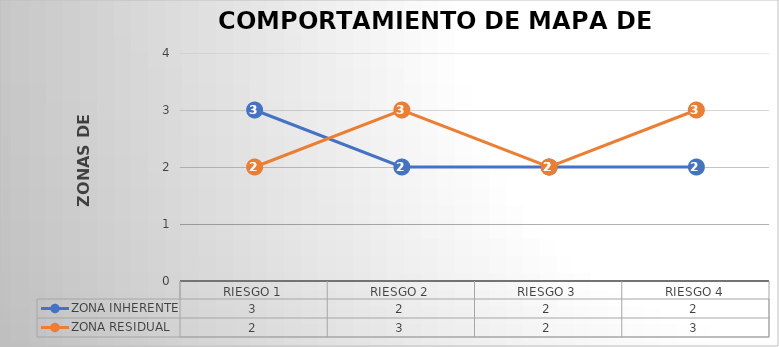
| Category | ZONA INHERENTE | ZONA RESIDUAL |
|---|---|---|
| RIESGO 1 | 3 | 2 |
| RIESGO 2 | 2 | 3 |
| RIESGO 3 | 2 | 2 |
| RIESGO 4 | 2 | 3 |